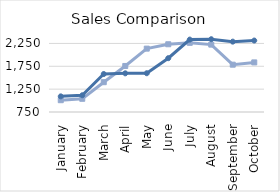
| Category | Sold 19 | Sold 20 |
|---|---|---|
| January | 1008 | 1092 |
| February | 1039 | 1116 |
| March | 1402 | 1581 |
| April | 1757 | 1596 |
| May | 2136 | 1598 |
| June | 2232 | 1927 |
| July | 2263 | 2334 |
| August | 2224 | 2342 |
| September | 1785 | 2289 |
| October | 1835 | 2313 |